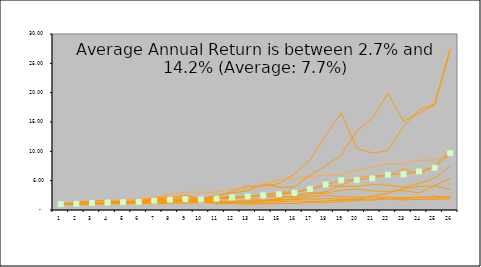
| Category | Series 0 | Series 1 | Series 2 | Series 3 | Series 4 | Series 5 | Series 6 | Series 7 | Series 8 | Series 9 | Series 10 |
|---|---|---|---|---|---|---|---|---|---|---|---|
| 0 | 1 | 1 | 1 | 1 | 1 | 1 | 1 | 1 | 1 | 1 | 1 |
| 1 | 1.325 | 0.896 | 0.898 | 1.047 | 1.062 | 0.987 | 1.174 | 1.207 | 0.998 | 1.016 | 1.061 |
| 2 | 1.612 | 1.155 | 0.979 | 1.263 | 1.113 | 1.205 | 1.182 | 1.388 | 1.061 | 0.972 | 1.193 |
| 3 | 1.618 | 1.327 | 1.215 | 1.286 | 1.136 | 1.501 | 1.288 | 1.232 | 1.121 | 1.059 | 1.278 |
| 4 | 1.385 | 1.393 | 1.191 | 1.344 | 1.041 | 1.76 | 1.569 | 1.381 | 1.161 | 1.19 | 1.341 |
| 5 | 1.577 | 1.572 | 1.374 | 1.218 | 1.197 | 1.885 | 1.371 | 1.432 | 1.159 | 1.203 | 1.399 |
| 6 | 1.862 | 2.046 | 1.591 | 1.433 | 1.059 | 2.087 | 1.822 | 1.407 | 1.09 | 1.538 | 1.594 |
| 7 | 2.085 | 2.343 | 1.955 | 1.445 | 1.168 | 2.718 | 1.519 | 1.606 | 1.44 | 1.472 | 1.775 |
| 8 | 2.442 | 1.825 | 2.518 | 1.418 | 1.14 | 3.017 | 1.745 | 1.631 | 1.579 | 1.452 | 1.877 |
| 9 | 1.691 | 1.656 | 1.88 | 1.628 | 1.35 | 3.051 | 1.993 | 1.394 | 1.605 | 1.803 | 1.805 |
| 10 | 1.902 | 2.119 | 2.347 | 1.566 | 1.092 | 3.011 | 2.49 | 1.345 | 1.342 | 2.133 | 1.935 |
| 11 | 2.018 | 2.35 | 3.166 | 1.326 | 1.102 | 3.56 | 2.928 | 1.451 | 1.314 | 2.108 | 2.132 |
| 12 | 2.272 | 2.103 | 4.1 | 1.415 | 1.004 | 3.631 | 3.232 | 1.69 | 1.252 | 2.341 | 2.304 |
| 13 | 2.456 | 1.657 | 4.039 | 1.586 | 1.024 | 4.267 | 4.476 | 1.541 | 1.298 | 2.582 | 2.493 |
| 14 | 2.268 | 1.956 | 4.497 | 1.796 | 1.129 | 5.19 | 3.862 | 1.64 | 1.432 | 3.034 | 2.68 |
| 15 | 2.162 | 2.458 | 6.135 | 1.799 | 1.1 | 5.251 | 3.922 | 1.863 | 1.526 | 3.083 | 2.93 |
| 16 | 2.614 | 2.953 | 8.498 | 1.854 | 1.255 | 5.694 | 5.958 | 2.247 | 1.415 | 3.5 | 3.599 |
| 17 | 3.095 | 2.813 | 12.696 | 1.942 | 1.247 | 5.941 | 7.48 | 2.519 | 1.555 | 4.203 | 4.349 |
| 18 | 4.21 | 3.362 | 16.554 | 1.849 | 1.413 | 5.95 | 9.353 | 2.263 | 1.669 | 4.033 | 5.066 |
| 19 | 5.417 | 3.576 | 10.558 | 1.854 | 1.613 | 6.789 | 13.471 | 2.178 | 1.79 | 4.036 | 5.128 |
| 20 | 5.864 | 3.259 | 9.708 | 1.643 | 1.806 | 7.301 | 15.6 | 2.177 | 2.345 | 4.334 | 5.404 |
| 21 | 5.821 | 3.183 | 10.147 | 2.121 | 1.839 | 7.884 | 19.889 | 2.179 | 2.853 | 4.272 | 6.019 |
| 22 | 7.035 | 3.311 | 14.273 | 2.075 | 1.728 | 7.822 | 15.118 | 1.926 | 3.664 | 3.846 | 6.08 |
| 23 | 6.092 | 2.914 | 17.073 | 2.06 | 1.808 | 8.5 | 16.502 | 2.227 | 4.005 | 4.503 | 6.568 |
| 24 | 7.587 | 4.139 | 18.121 | 2.378 | 1.825 | 8.528 | 17.883 | 2.051 | 4.128 | 5.428 | 7.207 |
| 25 | 10.073 | 5.387 | 27.496 | 2.053 | 1.946 | 9.185 | 27.211 | 2.391 | 3.507 | 7.486 | 9.674 |